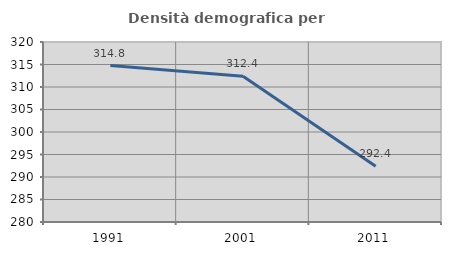
| Category | Densità demografica |
|---|---|
| 1991.0 | 314.772 |
| 2001.0 | 312.413 |
| 2011.0 | 292.413 |